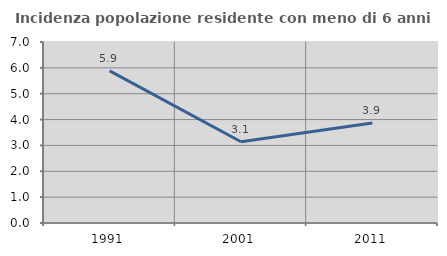
| Category | Incidenza popolazione residente con meno di 6 anni |
|---|---|
| 1991.0 | 5.882 |
| 2001.0 | 3.141 |
| 2011.0 | 3.867 |